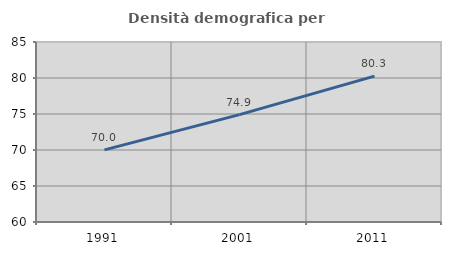
| Category | Densità demografica |
|---|---|
| 1991.0 | 70.02 |
| 2001.0 | 74.908 |
| 2011.0 | 80.262 |